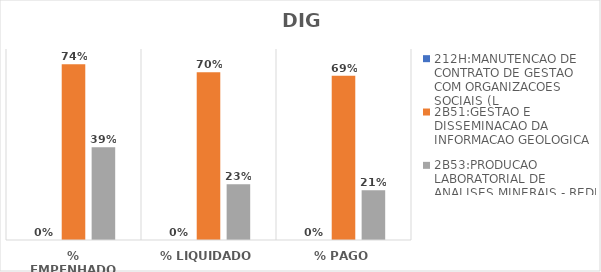
| Category | 212H:MANUTENCAO DE CONTRATO DE GESTAO COM ORGANIZACOES SOCIAIS (L | 2B51:GESTAO E DISSEMINACAO DA INFORMACAO GEOLOGICA | 2B53:PRODUCAO LABORATORIAL DE ANALISES MINERAIS - REDE LAMIN |
|---|---|---|---|
| % EMPENHADO | 0 | 0.736 | 0.389 |
| % LIQUIDADO | 0 | 0.703 | 0.234 |
| % PAGO | 0 | 0.688 | 0.208 |